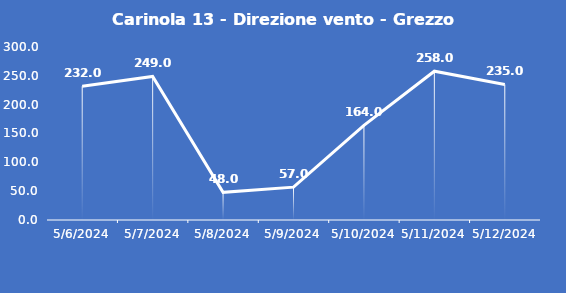
| Category | Carinola 13 - Direzione vento - Grezzo (°N) |
|---|---|
| 5/6/24 | 232 |
| 5/7/24 | 249 |
| 5/8/24 | 48 |
| 5/9/24 | 57 |
| 5/10/24 | 164 |
| 5/11/24 | 258 |
| 5/12/24 | 235 |